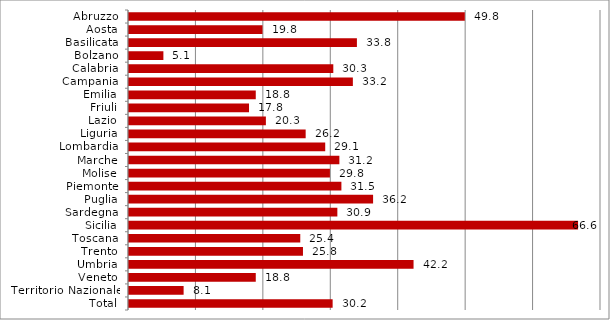
| Category | Series 0 |
|---|---|
| Abruzzo | 49.8 |
| Aosta | 19.8 |
| Basilicata | 33.8 |
| Bolzano | 5.1 |
| Calabria | 30.3 |
| Campania | 33.2 |
| Emilia | 18.8 |
| Friuli | 17.8 |
| Lazio | 20.3 |
| Liguria | 26.2 |
| Lombardia | 29.1 |
| Marche | 31.2 |
| Molise | 29.8 |
| Piemonte | 31.5 |
| Puglia | 36.2 |
| Sardegna | 30.9 |
| Sicilia | 66.6 |
| Toscana | 25.4 |
| Trento | 25.8 |
| Umbria | 42.2 |
| Veneto | 18.8 |
| Territorio Nazionale | 8.1 |
| Total | 30.2 |